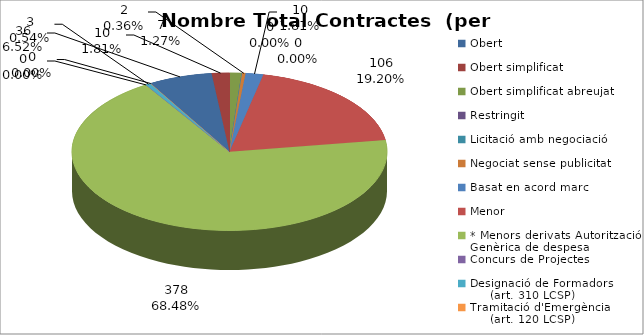
| Category | Nombre Total Contractes |
|---|---|
| Obert | 36 |
| Obert simplificat | 10 |
| Obert simplificat abreujat | 7 |
| Restringit | 0 |
| Licitació amb negociació | 0 |
| Negociat sense publicitat | 2 |
| Basat en acord marc | 10 |
| Menor | 106 |
| * Menors derivats Autorització Genèrica de despesa | 378 |
| Concurs de Projectes | 0 |
| Designació de Formadors
     (art. 310 LCSP) | 3 |
| Tramitació d'Emergència
     (art. 120 LCSP) | 0 |